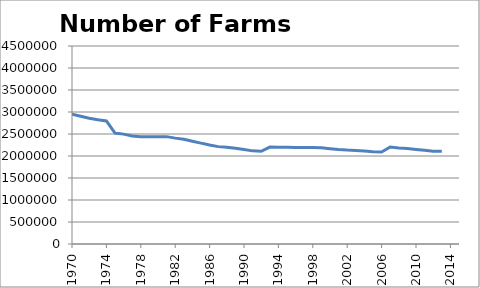
| Category | Number of Farms                                                                                                                               |
|---|---|
| 1960.0 | 3962520 |
| 1961.0 | 3825410 |
| 1962.0 | 3692410 |
| 1963.0 | 3572200 |
| 1964.0 | 3456690 |
| 1965.0 | 3356170 |
| 1966.0 | 3257040 |
| 1967.0 | 3161730 |
| 1968.0 | 3070860 |
| 1969.0 | 3000180 |
| 1970.0 | 2949140 |
| 1971.0 | 2902310 |
| 1972.0 | 2859880 |
| 1973.0 | 2823260 |
| 1974.0 | 2795460 |
| 1975.0 | 2521420 |
| 1976.0 | 2497270 |
| 1977.0 | 2455830 |
| 1978.0 | 2436250 |
| 1979.0 | 2437300 |
| 1980.0 | 2439510 |
| 1981.0 | 2439920 |
| 1982.0 | 2406550 |
| 1983.0 | 2378620 |
| 1984.0 | 2333810 |
| 1985.0 | 2292530 |
| 1986.0 | 2249820 |
| 1987.0 | 2212960 |
| 1988.0 | 2200940 |
| 1989.0 | 2174520 |
| 1990.0 | 2145820 |
| 1991.0 | 2116760 |
| 1992.0 | 2107840 |
| 1993.0 | 2201590 |
| 1994.0 | 2197690 |
| 1995.0 | 2196400 |
| 1996.0 | 2190500 |
| 1997.0 | 2190510 |
| 1998.0 | 2192330 |
| 1999.0 | 2187280 |
| 2000.0 | 2166780 |
| 2001.0 | 2148630 |
| 2002.0 | 2135360 |
| 2003.0 | 2126860 |
| 2004.0 | 2112970 |
| 2005.0 | 2098690 |
| 2006.0 | 2088790 |
| 2007.0 | 2204600 |
| 2008.0 | 2184500 |
| 2009.0 | 2169660 |
| 2010.0 | 2149520 |
| 2011.0 | 2131240 |
| 2012.0 | 2109810 |
| 2013.0 | 2109810 |